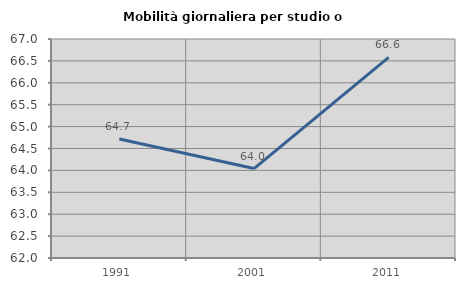
| Category | Mobilità giornaliera per studio o lavoro |
|---|---|
| 1991.0 | 64.718 |
| 2001.0 | 64.042 |
| 2011.0 | 66.58 |